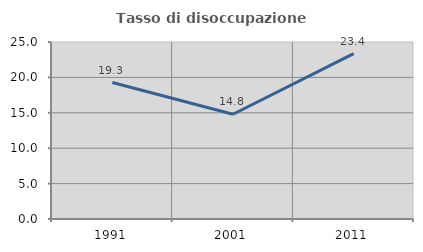
| Category | Tasso di disoccupazione giovanile  |
|---|---|
| 1991.0 | 19.269 |
| 2001.0 | 14.796 |
| 2011.0 | 23.358 |